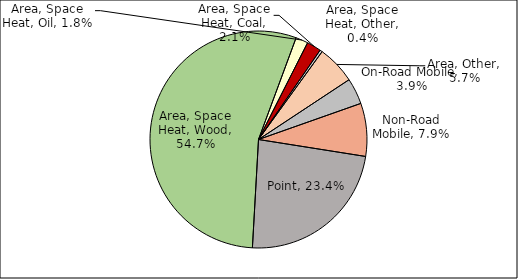
| Category | Series 0 |
|---|---|
| Point | 0.234 |
| Area, Space Heat, Wood | 0.547 |
| Area, Space Heat, Oil | 0.018 |
| Area, Space Heat, Coal | 0.021 |
| Area, Space Heat, Other | 0.004 |
| Area, Other | 0.057 |
| On-Road Mobile | 0.039 |
| Non-Road Mobile | 0.079 |